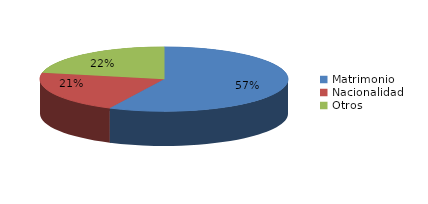
| Category | Series 0 |
|---|---|
| Matrimonio | 1922 |
| Nacionalidad | 706 |
| Otros | 733 |